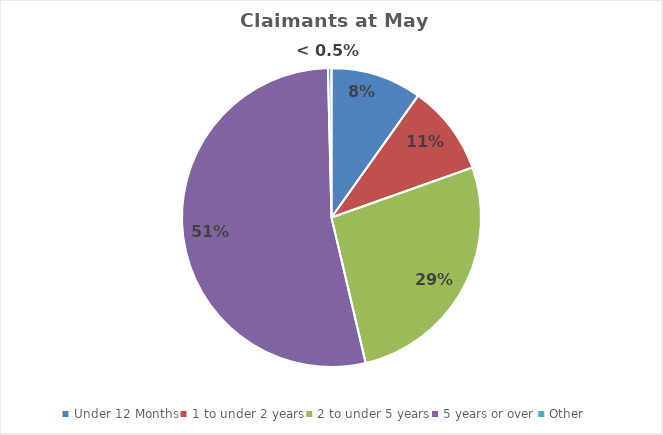
| Category | Series 0 |
|---|---|
| Under 12 Months | 7380 |
| 1 to under 2 years | 7310 |
| 2 to under 5 years | 20080 |
| 5 years or over | 40000 |
| Other | 290 |